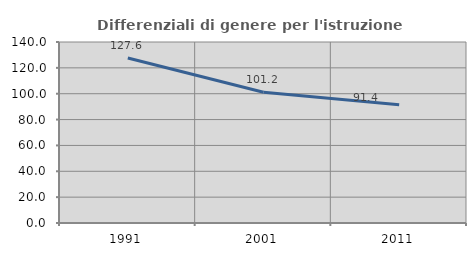
| Category | Differenziali di genere per l'istruzione superiore |
|---|---|
| 1991.0 | 127.621 |
| 2001.0 | 101.16 |
| 2011.0 | 91.385 |